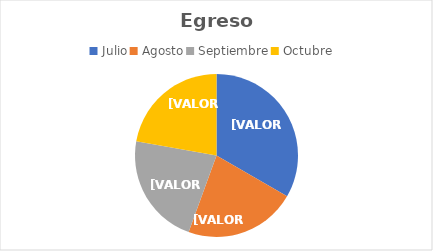
| Category | Series 0 |
|---|---|
| Julio | 0.3 |
| Agosto | 0.2 |
| Septiembre | 0.2 |
| Octubre | 0.2 |